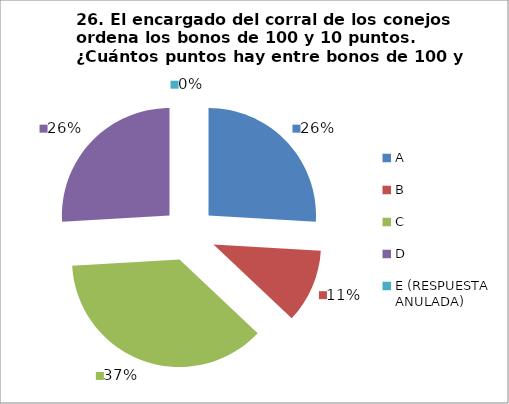
| Category | CANTIDAD DE RESPUESTAS PREGUNTA (26) | PORCENTAJE |
|---|---|---|
| A | 7 | 0.259 |
| B | 3 | 0.111 |
| C | 10 | 0.37 |
| D | 7 | 0.259 |
| E (RESPUESTA ANULADA) | 0 | 0 |